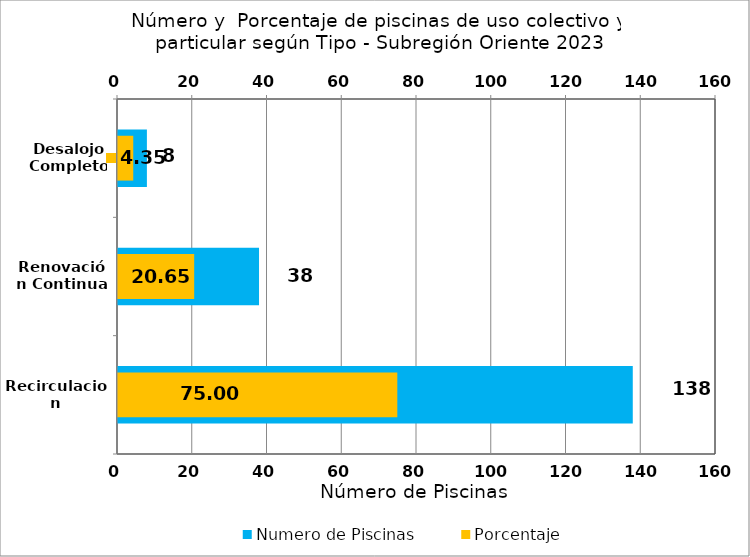
| Category | Numero de Piscinas |
|---|---|
| Recirculacion | 138 |
| Renovación Continua | 38 |
| Desalojo Completo | 8 |